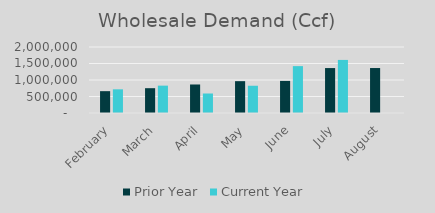
| Category | Prior Year | Current Year |
|---|---|---|
| February | 661790 | 717715 |
| March | 751769 | 829129 |
| April | 864122 | 591056.98 |
| May | 964707 | 825870 |
| June | 973004 | 1420311.82 |
| July | 1361707 | 1608413.16 |
| August | 1362622 | 0 |